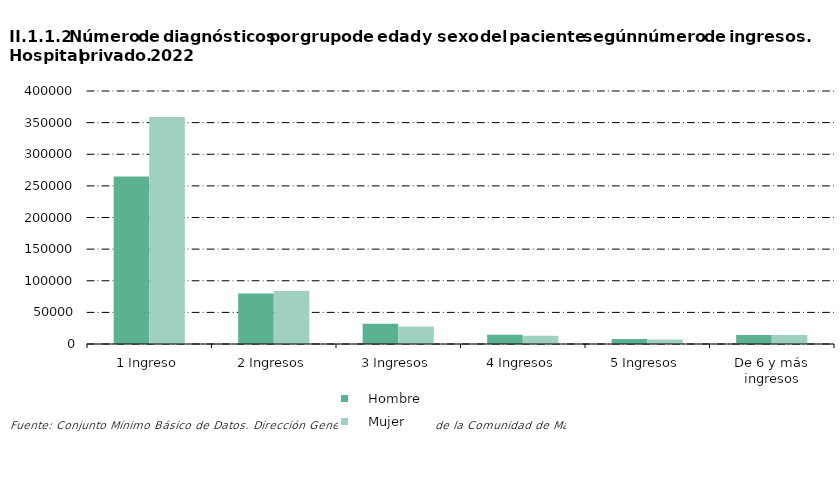
| Category |     Hombre |     Mujer |
|---|---|---|
| 1 Ingreso | 264909 | 358792 |
| 2 Ingresos | 79972 | 83803 |
| 3 Ingresos | 31976 | 27567 |
| 4 Ingresos | 14695 | 12942 |
| 5 Ingresos | 7867 | 7122 |
| De 6 y más ingresos | 14212 | 14065 |